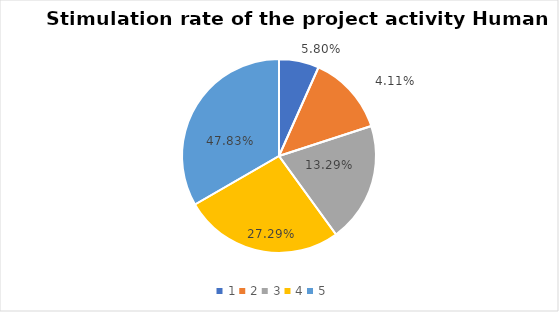
| Category | Series 0 | Series 1 |
|---|---|---|
| 0 | 1 | 0.058 |
| 1 | 2 | 0.041 |
| 2 | 3 | 0.133 |
| 3 | 4 | 0.273 |
| 4 | 5 | 0.478 |